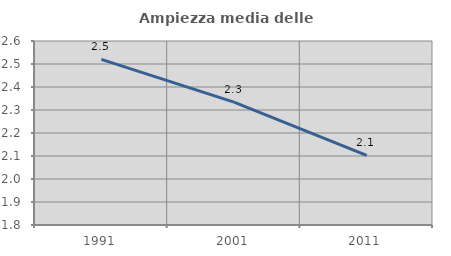
| Category | Ampiezza media delle famiglie |
|---|---|
| 1991.0 | 2.52 |
| 2001.0 | 2.334 |
| 2011.0 | 2.103 |